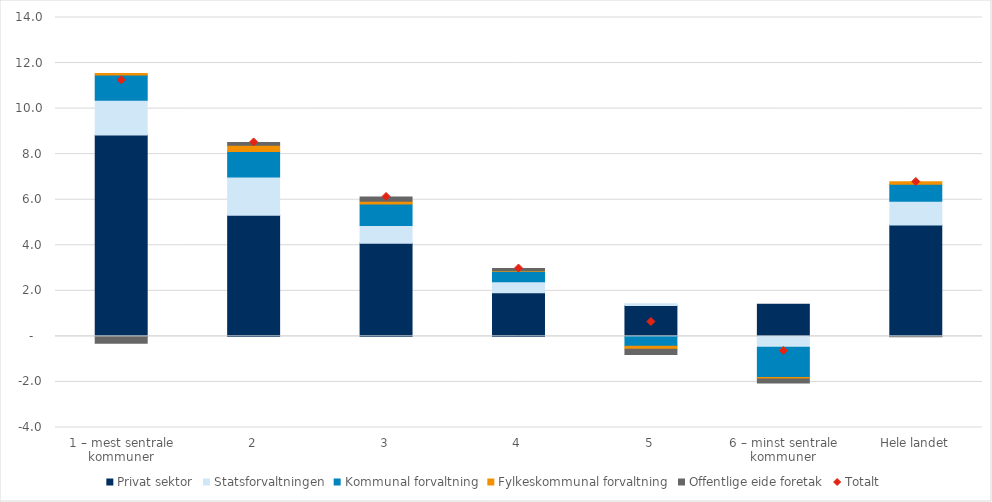
| Category |  Privat sektor  |  Statsforvaltningen  |  Kommunal forvaltning  |  Fylkeskommunal forvaltning  |  Offentlige eide foretak  |
|---|---|---|---|---|---|
| 1 – mest sentrale kommuner | 8.846 | 1.524 | 1.103 | 0.067 | -0.301 |
| 2 | 5.319 | 1.679 | 1.121 | 0.278 | 0.119 |
| 3 | 4.088 | 0.776 | 0.944 | 0.127 | 0.187 |
| 4 | 1.915 | 0.482 | 0.464 | 0.036 | 0.082 |
| 5 | 1.36 | 0.072 | -0.437 | -0.128 | -0.235 |
| 6 – minst sentrale kommuner | 1.406 | -0.475 | -1.332 | -0.068 | -0.174 |
| Hele landet | 4.896 | 1.039 | 0.748 | 0.109 | -0.014 |